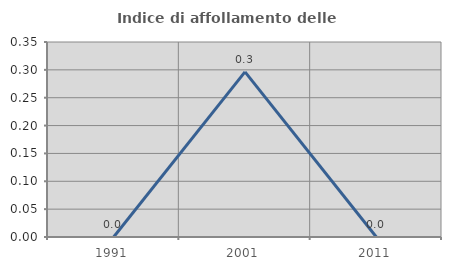
| Category | Indice di affollamento delle abitazioni  |
|---|---|
| 1991.0 | 0 |
| 2001.0 | 0.296 |
| 2011.0 | 0 |